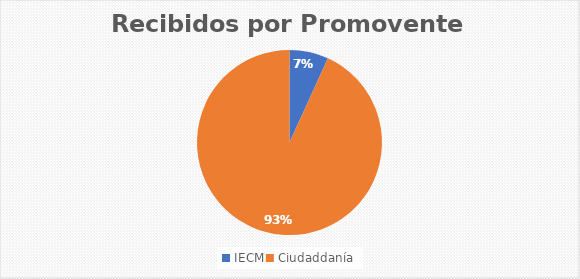
| Category | Series 0 |
|---|---|
| IECM | 3 |
| Ciudaddanía | 41 |